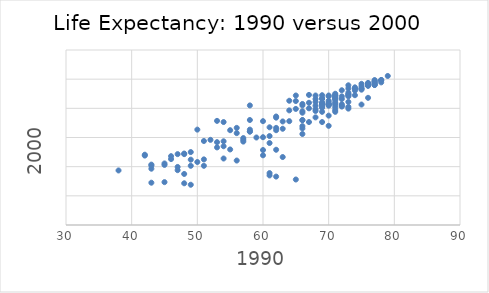
| Category | Series 0 |
|---|---|
| 49.0 | 55 |
| 69.0 | 73.5 |
| 68.0 | 72.2 |
| 43.0 | 49.3 |
| 71.0 | 74.6 |
| 73.0 | 74.1 |
| 67.0 | 71.9 |
| 77.0 | 79.7 |
| 76.0 | 78.2 |
| 63.0 | 65.5 |
| 72.0 | 70.9 |
| 73.0 | 70.5 |
| 60.0 | 65.6 |
| 74.0 | 74.5 |
| 71.0 | 68.8 |
| 76.0 | 77.7 |
| 71.0 | 70.3 |
| 53.0 | 56.6 |
| 53.0 | 65.7 |
| 58.0 | 66 |
| 73.0 | 75.4 |
| 65.0 | 45.6 |
| 66.0 | 71.5 |
| 73.0 | 72.2 |
| 71.0 | 71.6 |
| 50.0 | 51.6 |
| 49.0 | 43.8 |
| 51.0 | 50.3 |
| 66.0 | 71 |
| 54.0 | 58.7 |
| 54.0 | 52.8 |
| 77.0 | 79.1 |
| 48.0 | 44.3 |
| 45.0 | 51.1 |
| 73.0 | 76.8 |
| 69.0 | 71.6 |
| 71.0 | 73.7 |
| 56.0 | 61.5 |
| 56.0 | 52.1 |
| 77.0 | 78 |
| 73.0 | 74.4 |
| 74.0 | 76.8 |
| 76.0 | 78.7 |
| 71.0 | 75 |
| 70.0 | 64 |
| 49.0 | 52.4 |
| 75.0 | 76.9 |
| 57.0 | 59.8 |
| 69.0 | 73.2 |
| 69.0 | 74.5 |
| 65.0 | 69.8 |
| 65.0 | 72.5 |
| 48.0 | 54.3 |
| 48.0 | 54.5 |
| 70.0 | 70.9 |
| 61.0 | 47 |
| 45.0 | 50.6 |
| 66.0 | 65.9 |
| 75.0 | 77.6 |
| 78.0 | 78.9 |
| 61.0 | 58.1 |
| 52.0 | 59.2 |
| 71.0 | 69.4 |
| 76.0 | 78.1 |
| 57.0 | 59.2 |
| 77.0 | 78.2 |
| 70.0 | 72 |
| 62.0 | 66.8 |
| 47.0 | 54.3 |
| 49.0 | 50.3 |
| 63.0 | 63 |
| 54.0 | 57 |
| 67.0 | 70 |
| 69.0 | 71.3 |
| 78.0 | 79.7 |
| 58.0 | 62.1 |
| 62.0 | 67.2 |
| 64.0 | 72.6 |
| 69.0 | 68.8 |
| 75.0 | 76.4 |
| 77.0 | 78.6 |
| 77.0 | 79.4 |
| 71.0 | 74.2 |
| 79.0 | 81.1 |
| 70.0 | 72.6 |
| 66.0 | 63.1 |
| 60.0 | 53.9 |
| 60.0 | 55.7 |
| 73.0 | 77.9 |
| 66.0 | 66 |
| 53.0 | 58.4 |
| 69.0 | 70.2 |
| 67.0 | 74.6 |
| 61.0 | 47.8 |
| 42.0 | 53.8 |
| 68.0 | 74.4 |
| 71.0 | 72 |
| 76.0 | 78.2 |
| 51.0 | 58.8 |
| 45.0 | 44.7 |
| 71.0 | 72.8 |
| 58.0 | 71 |
| 46.0 | 52.6 |
| 76.0 | 77.9 |
| 58.0 | 62 |
| 70.0 | 71.2 |
| 71.0 | 74.4 |
| 66.0 | 61.2 |
| 61.0 | 60.5 |
| 76.0 | 73.6 |
| 64.0 | 69.3 |
| 43.0 | 50.7 |
| 59.0 | 60 |
| 63.0 | 53.3 |
| 54.0 | 65.3 |
| 77.0 | 78 |
| 76.0 | 78.6 |
| 71.0 | 73.3 |
| 43.0 | 50.4 |
| 46.0 | 53.6 |
| 77.0 | 78.5 |
| 68.0 | 69.1 |
| 60.0 | 60.1 |
| 74.0 | 77.2 |
| 56.0 | 63.3 |
| 73.0 | 74.8 |
| 70.0 | 74.4 |
| 66.0 | 69 |
| 71.0 | 73.7 |
| 74.0 | 76.6 |
| 75.0 | 71.3 |
| 72.0 | 76.2 |
| 68.0 | 66.9 |
| 71.0 | 71.1 |
| 70.0 | 71.4 |
| 69.0 | 65.3 |
| 48.0 | 47.5 |
| 68.0 | 73.2 |
| 72.0 | 70.6 |
| 66.0 | 68.5 |
| 61.0 | 63.5 |
| 69.0 | 70.5 |
| 57.0 | 58.6 |
| 72.0 | 71.4 |
| 69.0 | 71.9 |
| 38.0 | 48.7 |
| 75.0 | 78.4 |
| 71.0 | 73.3 |
| 74.0 | 76.1 |
| 62.0 | 62.5 |
| 47.0 | 49.9 |
| 62.0 | 55.8 |
| 42.0 | 54.1 |
| 77.0 | 79.1 |
| 69.0 | 71.9 |
| 55.0 | 62.5 |
| 73.0 | 69.9 |
| 78.0 | 79.6 |
| 78.0 | 79.7 |
| 70.0 | 71.5 |
| 64.0 | 65.6 |
| 69.0 | 71.3 |
| 50.0 | 62.7 |
| 55.0 | 55.9 |
| 68.0 | 70.9 |
| 68.0 | 69.7 |
| 70.0 | 74.1 |
| 65.0 | 74.4 |
| 62.0 | 63.3 |
| 47.0 | 48.8 |
| 70.0 | 67.5 |
| 72.0 | 73.2 |
| 76.0 | 77.9 |
| 51.0 | 52.5 |
| 75.0 | 76.7 |
| 73.0 | 74.8 |
| 67.0 | 65.3 |
| 66.0 | 63.9 |
| 72.0 | 74.1 |
| 70.0 | 71.4 |
| 58.0 | 62.7 |
| 43.0 | 44.5 |
| 62.0 | 46.6 |